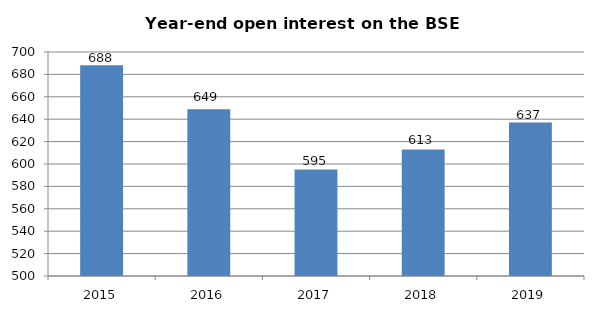
| Category | BSE contracts (thousands) |
|---|---|
| 2015.0 | 688.194 |
| 2016.0 | 648.876 |
| 2017.0 | 595 |
| 2018.0 | 613 |
| 2019.0 | 637 |